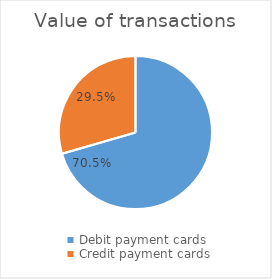
| Category | Value of transactions |
|---|---|
| Debit payment cards | 49326416784 |
| Credit payment cards | 20622756396 |